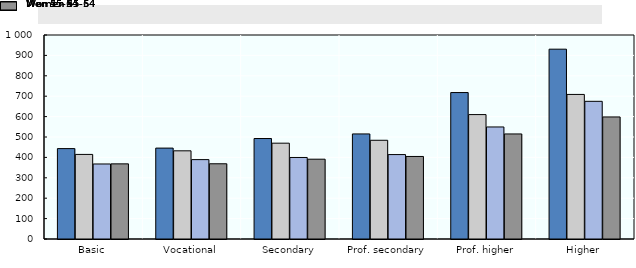
| Category | Men 45-54 | Men 55-64 | Women 45-54 | Women 55-64 |
|---|---|---|---|---|
| Basic | 443.133 | 414.665 | 367.78 | 368.313 |
| Vocational | 445.556 | 432.248 | 389.105 | 368.741 |
| Secondary | 492.501 | 469.688 | 399.662 | 391.174 |
| Prof. secondary | 515.046 | 483.928 | 413.904 | 404.64 |
| Prof. higher | 717.876 | 609.849 | 549.213 | 514.993 |
| Higher | 930.524 | 708.655 | 674.879 | 598.329 |